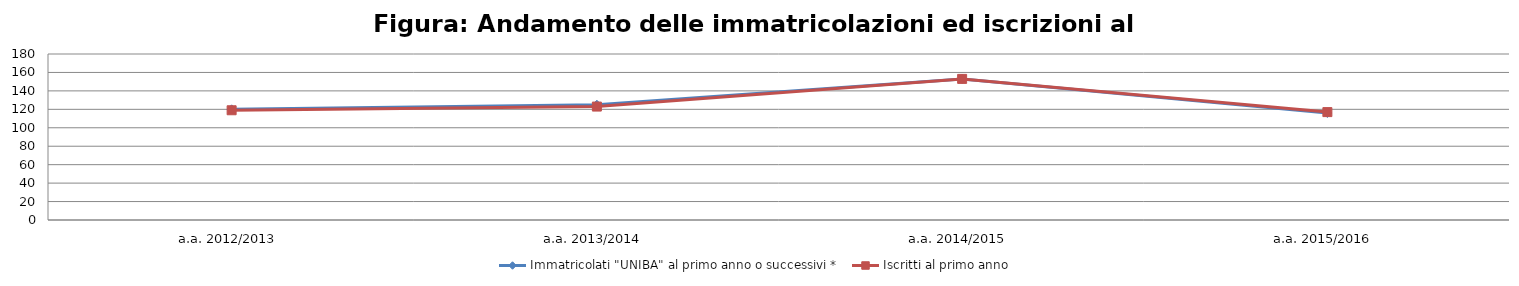
| Category | Immatricolati "UNIBA" al primo anno o successivi * | Iscritti al primo anno  |
|---|---|---|
| a.a. 2012/2013 | 120 | 119 |
| a.a. 2013/2014 | 125 | 123 |
| a.a. 2014/2015 | 153 | 153 |
| a.a. 2015/2016 | 116 | 117 |